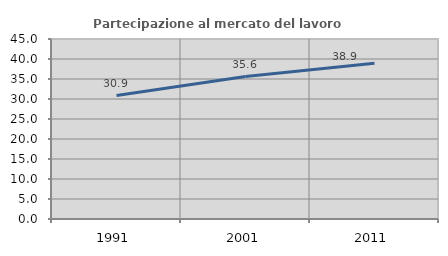
| Category | Partecipazione al mercato del lavoro  femminile |
|---|---|
| 1991.0 | 30.861 |
| 2001.0 | 35.606 |
| 2011.0 | 38.925 |